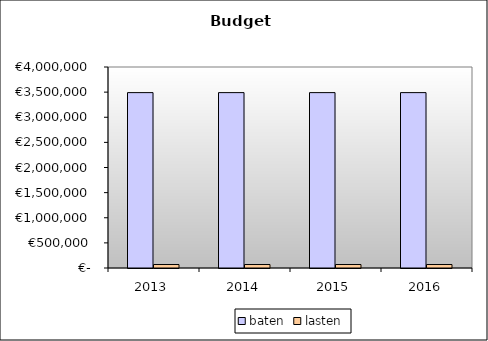
| Category | baten | lasten |
|---|---|---|
| 2013.0 | 3490143.34 | 69062.4 |
| 2014.0 | 3490143.34 | 69062.4 |
| 2015.0 | 3490143.34 | 69062.4 |
| 2016.0 | 3490143.34 | 69062.4 |